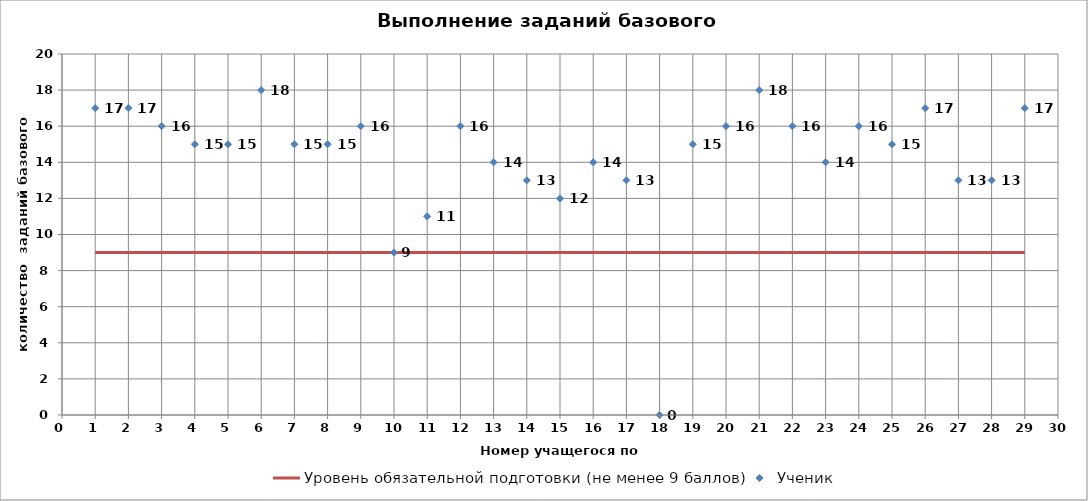
| Category | Уровень обязательной подготовки (не менее 9 баллов) |
|---|---|
| 0 | 9 |
| 1 | 9 |
| 2 | 9 |
| 3 | 9 |
| 4 | 9 |
| 5 | 9 |
| 6 | 9 |
| 7 | 9 |
| 8 | 9 |
| 9 | 9 |
| 10 | 9 |
| 11 | 9 |
| 12 | 9 |
| 13 | 9 |
| 14 | 9 |
| 15 | 9 |
| 16 | 9 |
| 17 | 9 |
| 18 | 9 |
| 19 | 9 |
| 20 | 9 |
| 21 | 9 |
| 22 | 9 |
| 23 | 9 |
| 24 | 9 |
| 25 | 9 |
| 26 | 9 |
| 27 | 9 |
| 28 | 9 |
| 29 | 9 |
| 30 | 9 |
| 31 | 9 |
| 32 | 9 |
| 33 | 9 |
| 34 | 9 |
| 35 | 9 |
| 36 | 9 |
| 37 | 9 |
| 38 | 9 |
| 39 | 9 |